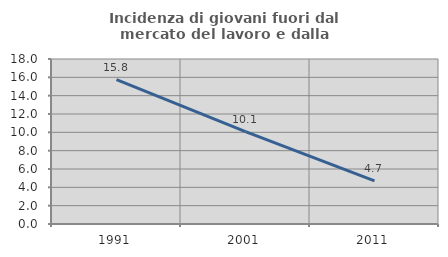
| Category | Incidenza di giovani fuori dal mercato del lavoro e dalla formazione  |
|---|---|
| 1991.0 | 15.755 |
| 2001.0 | 10.081 |
| 2011.0 | 4.701 |